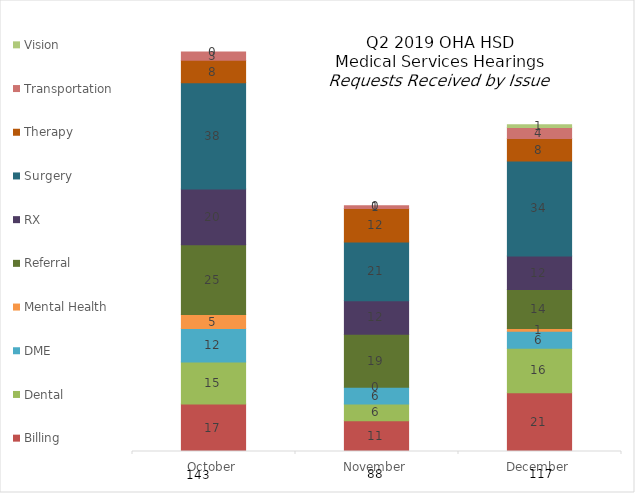
| Category | Billing | Dental | DME | Mental Health | Referral | RX | Surgery | Therapy | Transportation | Vision |
|---|---|---|---|---|---|---|---|---|---|---|
| October | 17 | 15 | 12 | 5 | 25 | 20 | 38 | 8 | 3 | 0 |
| November | 11 | 6 | 6 | 0 | 19 | 12 | 21 | 12 | 1 | 0 |
| December | 21 | 16 | 6 | 1 | 14 | 12 | 34 | 8 | 4 | 1 |